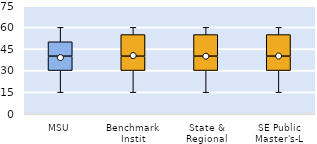
| Category | 25th | 50th | 75th |
|---|---|---|---|
| MSU | 30 | 10 | 10 |
| Benchmark Instit | 30 | 10 | 15 |
| State & Regional | 30 | 10 | 15 |
| SE Public Master's-L | 30 | 10 | 15 |